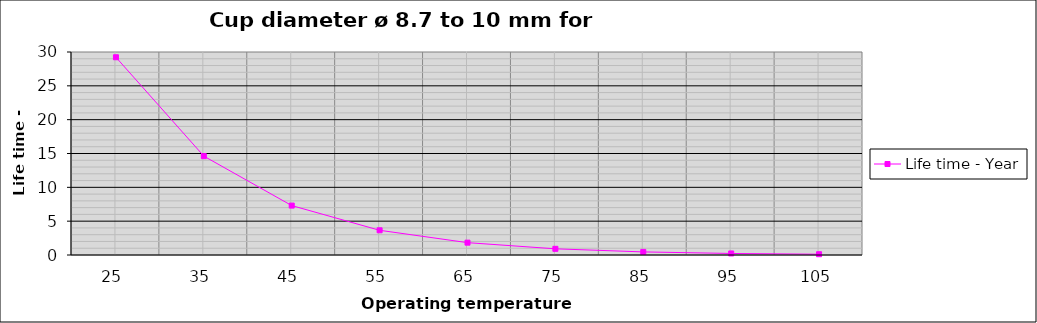
| Category | Life time - Year |
|---|---|
| 25.0 | 29.224 |
| 35.0 | 14.612 |
| 45.0 | 7.306 |
| 55.0 | 3.653 |
| 65.0 | 1.826 |
| 75.0 | 0.913 |
| 85.0 | 0.457 |
| 95.0 | 0.228 |
| 105.0 | 0.114 |